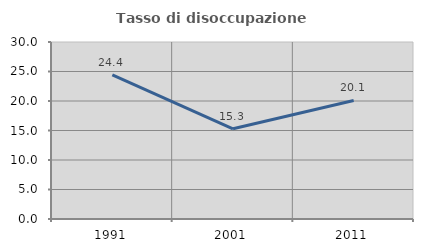
| Category | Tasso di disoccupazione giovanile  |
|---|---|
| 1991.0 | 24.436 |
| 2001.0 | 15.294 |
| 2011.0 | 20.098 |